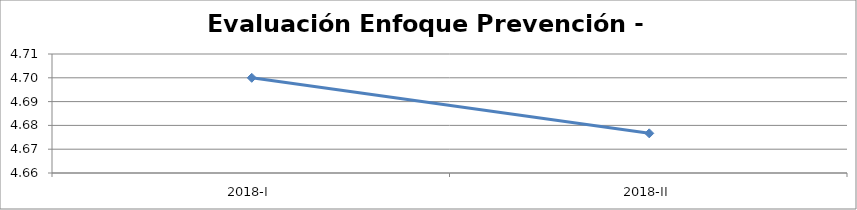
| Category | Series 0 |
|---|---|
| 2018-I | 4.7 |
| 2018-II | 4.677 |